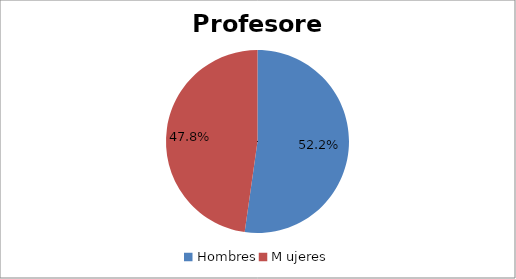
| Category | Series 0 |
|---|---|
| Hombres | 0.522 |
| M ujeres | 0.478 |